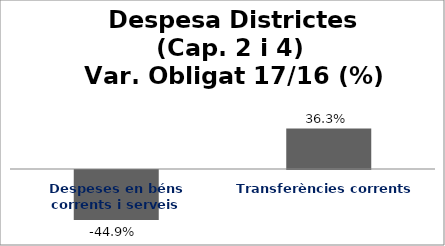
| Category | Series 0 |
|---|---|
| Despeses en béns corrents i serveis | -0.449 |
| Transferències corrents | 0.363 |